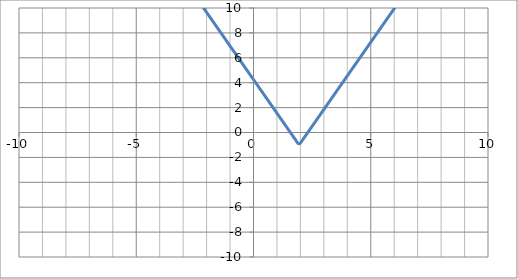
| Category | f(x) |
|---|---|
| -10.0 | 31.25 |
| -9.9 | 30.98 |
| -9.8 | 30.71 |
| -9.700000000000001 | 30.44 |
| -9.600000000000001 | 30.17 |
| -9.500000000000002 | 29.9 |
| -9.400000000000002 | 29.63 |
| -9.300000000000002 | 29.36 |
| -9.200000000000003 | 29.09 |
| -9.100000000000003 | 28.82 |
| -9.000000000000004 | 28.55 |
| -8.900000000000004 | 28.28 |
| -8.800000000000004 | 28.01 |
| -8.700000000000005 | 27.74 |
| -8.600000000000005 | 27.47 |
| -8.500000000000005 | 27.2 |
| -8.400000000000006 | 26.93 |
| -8.300000000000006 | 26.66 |
| -8.200000000000006 | 26.39 |
| -8.100000000000007 | 26.12 |
| -8.000000000000007 | 25.85 |
| -7.9000000000000075 | 25.58 |
| -7.800000000000008 | 25.31 |
| -7.700000000000008 | 25.04 |
| -7.6000000000000085 | 24.77 |
| -7.500000000000009 | 24.5 |
| -7.400000000000009 | 24.23 |
| -7.30000000000001 | 23.96 |
| -7.20000000000001 | 23.69 |
| -7.10000000000001 | 23.42 |
| -7.000000000000011 | 23.15 |
| -6.900000000000011 | 22.88 |
| -6.800000000000011 | 22.61 |
| -6.700000000000012 | 22.34 |
| -6.600000000000012 | 22.07 |
| -6.500000000000012 | 21.8 |
| -6.400000000000013 | 21.53 |
| -6.300000000000013 | 21.26 |
| -6.2000000000000135 | 20.99 |
| -6.100000000000014 | 20.72 |
| -6.000000000000014 | 20.45 |
| -5.900000000000015 | 20.18 |
| -5.800000000000015 | 19.91 |
| -5.700000000000015 | 19.64 |
| -5.600000000000016 | 19.37 |
| -5.500000000000016 | 19.1 |
| -5.400000000000016 | 18.83 |
| -5.300000000000017 | 18.56 |
| -5.200000000000017 | 18.29 |
| -5.100000000000017 | 18.02 |
| -5.000000000000018 | 17.75 |
| -4.900000000000018 | 17.48 |
| -4.8000000000000185 | 17.21 |
| -4.700000000000019 | 16.94 |
| -4.600000000000019 | 16.67 |
| -4.5000000000000195 | 16.4 |
| -4.40000000000002 | 16.13 |
| -4.30000000000002 | 15.86 |
| -4.200000000000021 | 15.59 |
| -4.100000000000021 | 15.32 |
| -4.000000000000021 | 15.05 |
| -3.9000000000000212 | 14.78 |
| -3.800000000000021 | 14.51 |
| -3.700000000000021 | 14.24 |
| -3.600000000000021 | 13.97 |
| -3.500000000000021 | 13.7 |
| -3.400000000000021 | 13.43 |
| -3.3000000000000207 | 13.16 |
| -3.2000000000000206 | 12.89 |
| -3.1000000000000205 | 12.62 |
| -3.0000000000000204 | 12.35 |
| -2.9000000000000203 | 12.08 |
| -2.8000000000000203 | 11.81 |
| -2.70000000000002 | 11.54 |
| -2.60000000000002 | 11.27 |
| -2.50000000000002 | 11 |
| -2.40000000000002 | 10.73 |
| -2.30000000000002 | 10.46 |
| -2.2000000000000197 | 10.19 |
| -2.1000000000000196 | 9.92 |
| -2.0000000000000195 | 9.65 |
| -1.9000000000000195 | 9.38 |
| -1.8000000000000194 | 9.11 |
| -1.7000000000000193 | 8.84 |
| -1.6000000000000192 | 8.57 |
| -1.500000000000019 | 8.3 |
| -1.400000000000019 | 8.03 |
| -1.300000000000019 | 7.76 |
| -1.2000000000000188 | 7.49 |
| -1.1000000000000187 | 7.22 |
| -1.0000000000000187 | 6.95 |
| -0.9000000000000187 | 6.68 |
| -0.8000000000000187 | 6.41 |
| -0.7000000000000187 | 6.14 |
| -0.6000000000000187 | 5.87 |
| -0.5000000000000188 | 5.6 |
| -0.4000000000000188 | 5.33 |
| -0.3000000000000188 | 5.06 |
| -0.2000000000000188 | 4.79 |
| -0.1000000000000188 | 4.52 |
| -1.8790524691780774e-14 | 4.25 |
| 0.09999999999998122 | 3.98 |
| 0.19999999999998122 | 3.71 |
| 0.2999999999999812 | 3.44 |
| 0.39999999999998126 | 3.17 |
| 0.49999999999998124 | 2.9 |
| 0.5999999999999812 | 2.63 |
| 0.6999999999999812 | 2.36 |
| 0.7999999999999812 | 2.09 |
| 0.8999999999999811 | 1.82 |
| 0.9999999999999811 | 1.55 |
| 1.0999999999999812 | 1.28 |
| 1.1999999999999813 | 1.01 |
| 1.2999999999999814 | 0.74 |
| 1.3999999999999815 | 0.47 |
| 1.4999999999999816 | 0.2 |
| 1.5999999999999817 | -0.07 |
| 1.6999999999999817 | -0.34 |
| 1.7999999999999818 | -0.61 |
| 1.899999999999982 | -0.88 |
| 1.999999999999982 | -0.85 |
| 2.099999999999982 | -0.58 |
| 2.199999999999982 | -0.31 |
| 2.299999999999982 | -0.04 |
| 2.399999999999982 | 0.23 |
| 2.4999999999999822 | 0.5 |
| 2.5999999999999823 | 0.77 |
| 2.6999999999999824 | 1.04 |
| 2.7999999999999825 | 1.31 |
| 2.8999999999999826 | 1.58 |
| 2.9999999999999827 | 1.85 |
| 3.0999999999999828 | 2.12 |
| 3.199999999999983 | 2.39 |
| 3.299999999999983 | 2.66 |
| 3.399999999999983 | 2.93 |
| 3.499999999999983 | 3.2 |
| 3.599999999999983 | 3.47 |
| 3.6999999999999833 | 3.74 |
| 3.7999999999999834 | 4.01 |
| 3.8999999999999835 | 4.28 |
| 3.9999999999999836 | 4.55 |
| 4.099999999999984 | 4.82 |
| 4.199999999999983 | 5.09 |
| 4.299999999999983 | 5.36 |
| 4.399999999999983 | 5.63 |
| 4.499999999999982 | 5.9 |
| 4.599999999999982 | 6.17 |
| 4.6999999999999815 | 6.44 |
| 4.799999999999981 | 6.71 |
| 4.899999999999981 | 6.98 |
| 4.9999999999999805 | 7.25 |
| 5.09999999999998 | 7.52 |
| 5.19999999999998 | 7.79 |
| 5.299999999999979 | 8.06 |
| 5.399999999999979 | 8.33 |
| 5.499999999999979 | 8.6 |
| 5.599999999999978 | 8.87 |
| 5.699999999999978 | 9.14 |
| 5.799999999999978 | 9.41 |
| 5.899999999999977 | 9.68 |
| 5.999999999999977 | 9.95 |
| 6.0999999999999766 | 10.22 |
| 6.199999999999976 | 10.49 |
| 6.299999999999976 | 10.76 |
| 6.3999999999999755 | 11.03 |
| 6.499999999999975 | 11.3 |
| 6.599999999999975 | 11.57 |
| 6.699999999999974 | 11.84 |
| 6.799999999999974 | 12.11 |
| 6.899999999999974 | 12.38 |
| 6.999999999999973 | 12.65 |
| 7.099999999999973 | 12.92 |
| 7.199999999999973 | 13.19 |
| 7.299999999999972 | 13.46 |
| 7.399999999999972 | 13.73 |
| 7.499999999999972 | 14 |
| 7.599999999999971 | 14.27 |
| 7.699999999999971 | 14.54 |
| 7.7999999999999705 | 14.81 |
| 7.89999999999997 | 15.08 |
| 7.99999999999997 | 15.35 |
| 8.09999999999997 | 15.62 |
| 8.199999999999969 | 15.89 |
| 8.299999999999969 | 16.16 |
| 8.399999999999968 | 16.43 |
| 8.499999999999968 | 16.7 |
| 8.599999999999968 | 16.97 |
| 8.699999999999967 | 17.24 |
| 8.799999999999967 | 17.51 |
| 8.899999999999967 | 17.78 |
| 8.999999999999966 | 18.05 |
| 9.099999999999966 | 18.32 |
| 9.199999999999966 | 18.59 |
| 9.299999999999965 | 18.86 |
| 9.399999999999965 | 19.13 |
| 9.499999999999964 | 19.4 |
| 9.599999999999964 | 19.67 |
| 9.699999999999964 | 19.94 |
| 9.799999999999963 | 20.21 |
| 9.899999999999963 | 20.48 |
| 9.999999999999963 | 20.75 |